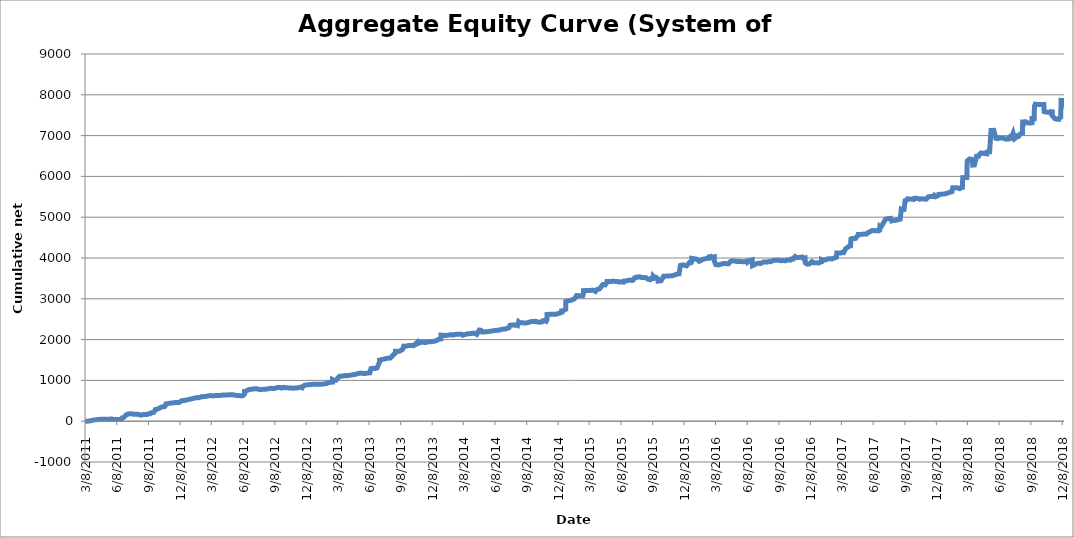
| Category | Series 0 |
|---|---|
| 3/8/11 | -0.48 |
| 3/18/11 | 2.52 |
| 3/23/11 | 7.84 |
| 3/25/11 | 14.73 |
| 3/25/11 | 19.9 |
| 3/30/11 | 25.12 |
| 4/1/11 | 24.35 |
| 4/1/11 | 22.37 |
| 4/4/11 | 30.29 |
| 4/5/11 | 30.83 |
| 4/6/11 | 36.66 |
| 4/11/11 | 36.3 |
| 4/13/11 | 41.86 |
| 4/21/11 | 45.6 |
| 4/25/11 | 47.14 |
| 5/9/11 | 47.8 |
| 5/20/11 | 51.32 |
| 5/25/11 | 51.32 |
| 5/31/11 | 41.53 |
| 5/31/11 | 43.62 |
| 6/7/11 | 43.72 |
| 6/14/11 | 43.76 |
| 6/15/11 | 44.97 |
| 6/21/11 | 48.27 |
| 6/22/11 | 48.52 |
| 6/22/11 | 55.12 |
| 6/23/11 | 79.96 |
| 6/27/11 | 85.18 |
| 6/29/11 | 89.69 |
| 6/29/11 | 108.52 |
| 7/6/11 | 163.64 |
| 7/12/11 | 176.84 |
| 7/20/11 | 183.99 |
| 7/20/11 | 187.84 |
| 7/21/11 | 190.32 |
| 7/21/11 | 182.13 |
| 7/25/11 | 172.68 |
| 8/2/11 | 170.04 |
| 8/4/11 | 166.14 |
| 8/8/11 | 169.65 |
| 8/9/11 | 166.17 |
| 8/16/11 | 148.46 |
| 8/17/11 | 150.55 |
| 8/25/11 | 164.96 |
| 8/26/11 | 166.06 |
| 8/30/11 | 166.94 |
| 9/2/11 | 162.89 |
| 9/8/11 | 182.56 |
| 9/8/11 | 186.85 |
| 9/12/11 | 184.1 |
| 9/14/11 | 186.1 |
| 9/14/11 | 194.94 |
| 9/14/11 | 199.23 |
| 9/15/11 | 208.14 |
| 9/22/11 | 210.54 |
| 9/26/11 | 257.94 |
| 9/27/11 | 276.84 |
| 9/27/11 | 283.66 |
| 9/30/11 | 286.41 |
| 10/7/11 | 308.85 |
| 10/11/11 | 329.42 |
| 10/12/11 | 333.1 |
| 10/13/11 | 340.3 |
| 10/14/11 | 343.34 |
| 10/17/11 | 349.84 |
| 10/20/11 | 351.44 |
| 10/20/11 | 349.8 |
| 10/24/11 | 356.19 |
| 10/24/11 | 374.99 |
| 10/27/11 | 391.71 |
| 10/28/11 | 424.21 |
| 10/28/11 | 430.51 |
| 10/31/11 | 426.99 |
| 11/7/11 | 439.09 |
| 11/9/11 | 437.41 |
| 11/9/11 | 441.81 |
| 11/9/11 | 449.28 |
| 11/17/11 | 448.04 |
| 11/25/11 | 460.24 |
| 12/1/11 | 455.29 |
| 12/1/11 | 458.89 |
| 12/1/11 | 465.27 |
| 12/8/11 | 467.43 |
| 12/9/11 | 489.79 |
| 12/12/11 | 499.79 |
| 12/13/11 | 501.11 |
| 12/13/11 | 501.63 |
| 12/15/11 | 503.83 |
| 12/19/11 | 505.15 |
| 12/19/11 | 505.92 |
| 1/4/12 | 535.53 |
| 1/4/12 | 543.93 |
| 1/25/12 | 578.04 |
| 2/1/12 | 576.94 |
| 2/2/12 | 579.58 |
| 2/7/12 | 597.26 |
| 2/8/12 | 598.61 |
| 2/21/12 | 608.18 |
| 3/1/12 | 625.62 |
| 3/2/12 | 628.15 |
| 3/5/12 | 627.67 |
| 3/5/12 | 623.35 |
| 3/12/12 | 619.31 |
| 3/12/12 | 618.54 |
| 3/13/12 | 624.02 |
| 3/19/12 | 628.5 |
| 3/26/12 | 628.1 |
| 3/28/12 | 634.26 |
| 4/3/12 | 633.6 |
| 4/3/12 | 648.6 |
| 4/17/12 | 644.31 |
| 4/23/12 | 640.15 |
| 4/25/12 | 643.57 |
| 4/26/12 | 645.87 |
| 4/27/12 | 654.67 |
| 5/9/12 | 650.15 |
| 5/15/12 | 634.64 |
| 5/15/12 | 643.68 |
| 5/15/12 | 654.39 |
| 5/16/12 | 650.34 |
| 5/17/12 | 647.06 |
| 5/24/12 | 629.68 |
| 5/31/12 | 622.09 |
| 6/1/12 | 616.97 |
| 6/7/12 | 623.37 |
| 6/8/12 | 628.32 |
| 6/12/12 | 667.47 |
| 6/12/12 | 733.2 |
| 6/15/12 | 738.27 |
| 6/18/12 | 745.53 |
| 6/20/12 | 762.03 |
| 6/22/12 | 767.43 |
| 7/2/12 | 784.53 |
| 7/3/12 | 787.06 |
| 7/6/12 | 789.26 |
| 7/10/12 | 791.46 |
| 7/17/12 | 795.64 |
| 7/19/12 | 800.37 |
| 7/25/12 | 775.77 |
| 8/1/12 | 779.62 |
| 8/6/12 | 781.22 |
| 8/7/12 | 787.16 |
| 8/15/12 | 787.44 |
| 8/17/12 | 789.12 |
| 8/20/12 | 794.18 |
| 8/20/12 | 806.14 |
| 8/21/12 | 807.34 |
| 8/23/12 | 801.78 |
| 8/29/12 | 806.18 |
| 8/31/12 | 802.22 |
| 9/4/12 | 800.92 |
| 9/7/12 | 807.2 |
| 9/10/12 | 811.38 |
| 9/14/12 | 823.08 |
| 9/14/12 | 826.32 |
| 9/18/12 | 825.96 |
| 9/20/12 | 828.32 |
| 9/24/12 | 823.59 |
| 9/24/12 | 815.22 |
| 9/27/12 | 811.89 |
| 9/27/12 | 814.59 |
| 10/3/12 | 829.67 |
| 10/8/12 | 822.63 |
| 10/8/12 | 818.23 |
| 10/10/12 | 814.53 |
| 10/10/12 | 814.93 |
| 10/17/12 | 816.58 |
| 10/19/12 | 808.33 |
| 10/31/12 | 809.09 |
| 10/31/12 | 810.17 |
| 11/2/12 | 830.19 |
| 11/15/12 | 819.52 |
| 11/23/12 | 837.59 |
| 11/26/12 | 822.19 |
| 11/28/12 | 853.06 |
| 11/30/12 | 867.25 |
| 12/3/12 | 882.73 |
| 12/4/12 | 896.13 |
| 12/10/12 | 890.74 |
| 12/10/12 | 892.54 |
| 12/12/12 | 897.82 |
| 12/20/12 | 899.03 |
| 12/28/12 | 903.31 |
| 1/4/13 | 905.95 |
| 1/4/13 | 898.39 |
| 1/15/13 | 906.58 |
| 1/16/13 | 911.31 |
| 1/16/13 | 915.49 |
| 1/28/13 | 910.17 |
| 2/1/13 | 918.42 |
| 2/5/13 | 923.5 |
| 2/8/13 | 944.75 |
| 2/8/13 | 948.43 |
| 2/13/13 | 949.09 |
| 2/13/13 | 958.45 |
| 2/15/13 | 956.81 |
| 2/22/13 | 958.11 |
| 2/22/13 | 1018.11 |
| 2/22/13 | 1005.13 |
| 2/26/13 | 999.85 |
| 2/27/13 | 1005.53 |
| 3/4/13 | 1004.21 |
| 3/11/13 | 1076.03 |
| 3/12/13 | 1096.18 |
| 3/14/13 | 1100.46 |
| 3/18/13 | 1100.57 |
| 3/20/13 | 1102.99 |
| 3/20/13 | 1117.14 |
| 4/2/13 | 1120.11 |
| 4/5/13 | 1112.96 |
| 4/10/13 | 1122.2 |
| 4/11/13 | 1122.59 |
| 4/22/13 | 1137.99 |
| 4/30/13 | 1149.4 |
| 4/30/13 | 1150.94 |
| 5/7/13 | 1170.05 |
| 5/16/13 | 1180.72 |
| 5/22/13 | 1168.84 |
| 5/30/13 | 1172.58 |
| 6/4/13 | 1182.23 |
| 6/10/13 | 1185.09 |
| 6/11/13 | 1197.3 |
| 6/13/13 | 1287.12 |
| 6/13/13 | 1280.08 |
| 6/14/13 | 1275.24 |
| 6/18/13 | 1296.94 |
| 6/20/13 | 1292.21 |
| 6/26/13 | 1291.76 |
| 6/26/13 | 1296.38 |
| 6/27/13 | 1297.94 |
| 6/28/13 | 1305.86 |
| 6/28/13 | 1301.79 |
| 7/1/13 | 1308.29 |
| 7/8/13 | 1448.29 |
| 7/8/13 | 1497.09 |
| 7/9/13 | 1512.49 |
| 7/10/13 | 1515.24 |
| 7/17/13 | 1514.24 |
| 7/17/13 | 1537.73 |
| 7/30/13 | 1542.25 |
| 8/1/13 | 1546.21 |
| 8/8/13 | 1547.13 |
| 8/9/13 | 1560.66 |
| 8/23/13 | 1675.5 |
| 8/23/13 | 1712.68 |
| 8/27/13 | 1711.03 |
| 8/28/13 | 1705.39 |
| 9/3/13 | 1712.79 |
| 9/4/13 | 1717.41 |
| 9/10/13 | 1746.41 |
| 9/12/13 | 1739.26 |
| 9/12/13 | 1753.12 |
| 9/13/13 | 1759.88 |
| 9/16/13 | 1837.1 |
| 9/19/13 | 1833.68 |
| 9/20/13 | 1851.56 |
| 10/1/13 | 1856.84 |
| 10/8/13 | 1858.6 |
| 10/14/13 | 1849.36 |
| 10/15/13 | 1866.96 |
| 10/15/13 | 1870.37 |
| 10/18/13 | 1880.89 |
| 10/23/13 | 1916.38 |
| 10/23/13 | 1888.21 |
| 10/28/13 | 1907.9 |
| 10/28/13 | 1920.14 |
| 11/6/13 | 1936.09 |
| 11/7/13 | 1934.73 |
| 11/18/13 | 1929.01 |
| 11/20/13 | 1929.67 |
| 11/25/13 | 1941.33 |
| 11/25/13 | 1950.02 |
| 11/29/13 | 1952.55 |
| 12/5/13 | 1946.06 |
| 12/18/13 | 1968.66 |
| 12/23/13 | 1988.36 |
| 12/23/13 | 2011.92 |
| 12/26/13 | 2007.41 |
| 12/30/13 | 2014.01 |
| 1/2/14 | 2017.43 |
| 1/2/14 | 2110.23 |
| 1/14/14 | 2100.44 |
| 1/15/14 | 2095.4 |
| 1/16/14 | 2096.94 |
| 1/17/14 | 2102.44 |
| 2/3/14 | 2121.8 |
| 2/6/14 | 2110.32 |
| 2/12/14 | 2127.37 |
| 3/3/14 | 2132.54 |
| 3/3/14 | 2115.51 |
| 3/4/14 | 2108.8 |
| 3/6/14 | 2108.36 |
| 3/7/14 | 2131.16 |
| 3/10/14 | 2118.65 |
| 3/10/14 | 2129.18 |
| 3/14/14 | 2127.53 |
| 3/19/14 | 2140.84 |
| 3/24/14 | 2140.84 |
| 3/27/14 | 2145.52 |
| 3/28/14 | 2141.22 |
| 4/2/14 | 2152.33 |
| 4/4/14 | 2154.73 |
| 4/4/14 | 2148.9 |
| 4/10/14 | 2153.82 |
| 4/11/14 | 2150.54 |
| 4/16/14 | 2128.65 |
| 4/17/14 | 2131.51 |
| 4/23/14 | 2234.06 |
| 4/25/14 | 2230.9 |
| 4/28/14 | 2229.25 |
| 5/1/14 | 2187.15 |
| 5/7/14 | 2188.06 |
| 5/13/14 | 2192.46 |
| 5/16/14 | 2191.03 |
| 5/21/14 | 2200 |
| 5/23/14 | 2206.93 |
| 5/27/14 | 2207.13 |
| 5/27/14 | 2212.17 |
| 5/30/14 | 2212.41 |
| 5/30/14 | 2225.61 |
| 6/9/14 | 2224.62 |
| 6/18/14 | 2230.12 |
| 7/2/14 | 2260.72 |
| 7/3/14 | 2268.97 |
| 7/10/14 | 2263.14 |
| 7/10/14 | 2280.22 |
| 7/15/14 | 2287.15 |
| 7/17/14 | 2297.15 |
| 7/18/14 | 2291.21 |
| 7/21/14 | 2350.88 |
| 7/22/14 | 2355.4 |
| 7/30/14 | 2361.6 |
| 8/5/14 | 2351.59 |
| 8/8/14 | 2358.84 |
| 8/12/14 | 2344.76 |
| 8/15/14 | 2437.73 |
| 8/19/14 | 2412.98 |
| 8/22/14 | 2413.4 |
| 8/22/14 | 2413.51 |
| 8/26/14 | 2411.71 |
| 8/28/14 | 2407.39 |
| 9/3/14 | 2404.97 |
| 9/3/14 | 2408.09 |
| 9/3/14 | 2406.11 |
| 9/8/14 | 2410.18 |
| 9/9/14 | 2429.21 |
| 9/10/14 | 2430.57 |
| 9/18/14 | 2433.27 |
| 9/22/14 | 2443.83 |
| 9/25/14 | 2446.71 |
| 9/25/14 | 2454.81 |
| 9/29/14 | 2444.55 |
| 10/3/14 | 2447.61 |
| 10/13/14 | 2423.85 |
| 10/22/14 | 2436.28 |
| 10/23/14 | 2440.02 |
| 10/24/14 | 2460.9 |
| 10/28/14 | 2468.42 |
| 10/28/14 | 2457.57 |
| 11/3/14 | 2447.62 |
| 11/5/14 | 2482.74 |
| 11/5/14 | 2615.34 |
| 11/6/14 | 2619.3 |
| 11/10/14 | 2619.06 |
| 11/11/14 | 2624.1 |
| 11/24/14 | 2619.54 |
| 12/3/14 | 2624.38 |
| 12/18/14 | 2667.48 |
| 12/18/14 | 2704.22 |
| 12/22/14 | 2706.97 |
| 12/30/14 | 2744.67 |
| 12/30/14 | 2764.62 |
| 12/30/14 | 2933.42 |
| 1/6/15 | 2952.5 |
| 1/12/15 | 2960.09 |
| 1/14/15 | 2981.15 |
| 1/23/15 | 2993.69 |
| 1/27/15 | 3037.03 |
| 1/28/15 | 3040.11 |
| 1/30/15 | 3080.11 |
| 2/5/15 | 3074.39 |
| 2/17/15 | 3073.87 |
| 2/19/15 | 3086.91 |
| 2/19/15 | 3132.93 |
| 2/19/15 | 3200.25 |
| 2/20/15 | 3213.66 |
| 3/20/15 | 3208.71 |
| 3/26/15 | 3180.11 |
| 3/30/15 | 3225.54 |
| 4/7/15 | 3245.43 |
| 4/8/15 | 3249.17 |
| 4/8/15 | 3250.25 |
| 4/16/15 | 3348.55 |
| 4/20/15 | 3349.21 |
| 4/22/15 | 3345.58 |
| 4/22/15 | 3347.26 |
| 4/23/15 | 3341.66 |
| 4/27/15 | 3384.43 |
| 4/28/15 | 3423.43 |
| 5/5/15 | 3424.43 |
| 5/11/15 | 3424.71 |
| 5/14/15 | 3429.77 |
| 5/14/15 | 3406.01 |
| 5/20/15 | 3427.97 |
| 5/26/15 | 3423.24 |
| 6/1/15 | 3419.61 |
| 6/1/15 | 3419.72 |
| 6/2/15 | 3413.44 |
| 6/4/15 | 3407.06 |
| 6/8/15 | 3418.56 |
| 6/15/15 | 3409.1 |
| 6/17/15 | 3436.7 |
| 6/19/15 | 3452.54 |
| 6/23/15 | 3438.14 |
| 6/26/15 | 3447.54 |
| 7/1/15 | 3456.54 |
| 7/7/15 | 3459.4 |
| 7/10/15 | 3448.18 |
| 7/13/15 | 3458.41 |
| 7/17/15 | 3513.85 |
| 7/21/15 | 3530.41 |
| 7/24/15 | 3525.21 |
| 7/31/15 | 3540.39 |
| 8/7/15 | 3520.37 |
| 8/19/15 | 3518.5 |
| 8/20/15 | 3516.82 |
| 8/21/15 | 3497.02 |
| 8/24/15 | 3485.12 |
| 8/31/15 | 3467.96 |
| 9/3/15 | 3498.32 |
| 9/8/15 | 3497.11 |
| 9/9/15 | 3499.07 |
| 9/9/15 | 3558.07 |
| 9/14/15 | 3515.57 |
| 9/17/15 | 3525.03 |
| 9/22/15 | 3493.04 |
| 9/22/15 | 3471.17 |
| 9/23/15 | 3434.65 |
| 9/28/15 | 3439.6 |
| 9/28/15 | 3439.33 |
| 10/2/15 | 3443.62 |
| 10/7/15 | 3516.42 |
| 10/7/15 | 3534.35 |
| 10/9/15 | 3552.87 |
| 10/19/15 | 3557.38 |
| 10/20/15 | 3562.5 |
| 11/4/15 | 3565.14 |
| 11/5/15 | 3582.3 |
| 11/17/15 | 3604.55 |
| 11/20/15 | 3613.02 |
| 11/23/15 | 3612.69 |
| 11/27/15 | 3818.49 |
| 12/4/15 | 3831.54 |
| 12/8/15 | 3822.66 |
| 12/9/15 | 3826.4 |
| 12/15/15 | 3808.4 |
| 12/16/15 | 3801.55 |
| 12/17/15 | 3823.88 |
| 12/23/15 | 3888.28 |
| 12/28/15 | 3884.43 |
| 12/28/15 | 3888.59 |
| 12/29/15 | 3884.19 |
| 12/30/15 | 3910.16 |
| 12/30/15 | 3990.8 |
| 12/31/15 | 3983.8 |
| 1/14/16 | 3969.72 |
| 1/20/16 | 3919.86 |
| 1/21/16 | 3928.33 |
| 1/25/16 | 3934.69 |
| 1/26/16 | 3938.76 |
| 1/29/16 | 3964.72 |
| 2/18/16 | 4001.13 |
| 2/19/16 | 4040.91 |
| 2/19/16 | 4083.04 |
| 2/23/16 | 4006.11 |
| 2/26/16 | 4018.51 |
| 3/4/16 | 4030.06 |
| 3/4/16 | 3934.77 |
| 3/8/16 | 3840.05 |
| 3/9/16 | 3852.04 |
| 3/10/16 | 3824.28 |
| 3/16/16 | 3829.23 |
| 3/18/16 | 3852.66 |
| 3/31/16 | 3866.85 |
| 3/31/16 | 3864.32 |
| 4/14/16 | 3857.52 |
| 4/15/16 | 3866.43 |
| 4/19/16 | 3908.63 |
| 4/19/16 | 3921.17 |
| 4/19/16 | 3931.29 |
| 4/26/16 | 3934.33 |
| 5/10/16 | 3913.1 |
| 5/10/16 | 3909.82 |
| 5/13/16 | 3912.46 |
| 5/13/16 | 3894.64 |
| 5/27/16 | 3910.48 |
| 6/1/16 | 3910.28 |
| 6/8/16 | 3925.84 |
| 6/9/16 | 3898.67 |
| 6/14/16 | 3931.07 |
| 6/14/16 | 3943.67 |
| 6/16/16 | 3951.35 |
| 6/16/16 | 3952.56 |
| 6/22/16 | 3952.89 |
| 6/23/16 | 3814.09 |
| 7/1/16 | 3845.33 |
| 7/6/16 | 3865.79 |
| 7/12/16 | 3875.23 |
| 7/15/16 | 3862.33 |
| 7/20/16 | 3880.25 |
| 7/21/16 | 3901.13 |
| 7/25/16 | 3901.89 |
| 7/27/16 | 3899.93 |
| 8/3/16 | 3898.29 |
| 8/8/16 | 3912.15 |
| 8/8/16 | 3917.75 |
| 8/15/16 | 3910.1 |
| 8/16/16 | 3911.26 |
| 8/16/16 | 3887.26 |
| 8/17/16 | 3895.06 |
| 8/18/16 | 3929.38 |
| 8/19/16 | 3943.13 |
| 8/24/16 | 3941.17 |
| 8/25/16 | 3944.91 |
| 8/25/16 | 3940.59 |
| 8/25/16 | 3944.36 |
| 9/1/16 | 3944.92 |
| 9/2/16 | 3954.41 |
| 9/7/16 | 3947.61 |
| 9/13/16 | 3933.53 |
| 9/19/16 | 3937.41 |
| 9/21/16 | 3949.73 |
| 9/21/16 | 3949.53 |
| 9/21/16 | 3931.78 |
| 9/27/16 | 3932.82 |
| 9/27/16 | 3908.84 |
| 9/28/16 | 3950.6 |
| 9/30/16 | 3947.27 |
| 10/3/16 | 3949.79 |
| 10/3/16 | 3947.43 |
| 10/5/16 | 3946.11 |
| 10/7/16 | 3947.59 |
| 10/11/16 | 3948.03 |
| 10/12/16 | 3944.67 |
| 10/13/16 | 3974.05 |
| 10/19/16 | 3974.05 |
| 10/21/16 | 4006.17 |
| 10/24/16 | 4032.82 |
| 10/24/16 | 4030.62 |
| 10/25/16 | 4026.14 |
| 10/26/16 | 4019.25 |
| 10/27/16 | 4009.98 |
| 10/28/16 | 4012.22 |
| 10/28/16 | 4019.24 |
| 11/2/16 | 4013.04 |
| 11/9/16 | 4017.68 |
| 11/11/16 | 4029.67 |
| 11/14/16 | 4024.06 |
| 11/17/16 | 3990.26 |
| 11/18/16 | 3978.9 |
| 11/22/16 | 4001.34 |
| 11/22/16 | 4015.18 |
| 11/23/16 | 3877.98 |
| 11/29/16 | 3847.82 |
| 12/1/16 | 3836.6 |
| 12/5/16 | 3857.66 |
| 12/6/16 | 3864.48 |
| 12/8/16 | 3882.16 |
| 12/9/16 | 3880.12 |
| 12/12/16 | 3910.26 |
| 12/15/16 | 3888.39 |
| 12/19/16 | 3883.63 |
| 12/27/16 | 3882.79 |
| 12/29/16 | 3874.08 |
| 12/29/16 | 3875.13 |
| 12/30/16 | 3875.25 |
| 1/9/17 | 3906.71 |
| 1/9/17 | 3961.91 |
| 1/9/17 | 3953.66 |
| 1/13/17 | 3949.92 |
| 1/20/17 | 3955.24 |
| 1/23/17 | 3960.3 |
| 1/25/17 | 3968.55 |
| 1/26/17 | 3977.02 |
| 1/27/17 | 3999.52 |
| 2/3/17 | 3983.4 |
| 2/3/17 | 3963.24 |
| 2/7/17 | 3975.48 |
| 2/7/17 | 3980.94 |
| 2/7/17 | 3988.77 |
| 2/13/17 | 3994.27 |
| 2/13/17 | 3999.77 |
| 2/15/17 | 4003.05 |
| 2/21/17 | 4018.56 |
| 2/22/17 | 4121.95 |
| 3/3/17 | 4120.96 |
| 3/3/17 | 4118.2 |
| 3/7/17 | 4123.2 |
| 3/9/17 | 4136.62 |
| 3/10/17 | 4137.94 |
| 3/14/17 | 4132.66 |
| 3/20/17 | 4230.26 |
| 3/22/17 | 4250.28 |
| 3/23/17 | 4250.61 |
| 3/28/17 | 4275.06 |
| 3/29/17 | 4277.14 |
| 3/29/17 | 4292.76 |
| 3/31/17 | 4300.35 |
| 4/3/17 | 4300.99 |
| 4/3/17 | 4299.87 |
| 4/4/17 | 4467.63 |
| 4/5/17 | 4468.11 |
| 4/5/17 | 4480.33 |
| 4/7/17 | 4480.21 |
| 4/10/17 | 4478.69 |
| 4/13/17 | 4477.26 |
| 4/18/17 | 4481.34 |
| 4/18/17 | 4487.64 |
| 4/21/17 | 4525.34 |
| 4/21/17 | 4531.94 |
| 4/24/17 | 4546.13 |
| 4/25/17 | 4577.59 |
| 5/2/17 | 4576.04 |
| 5/5/17 | 4582.08 |
| 5/16/17 | 4588.68 |
| 5/17/17 | 4578.03 |
| 5/19/17 | 4586.4 |
| 5/22/17 | 4605.25 |
| 5/23/17 | 4620.98 |
| 5/25/17 | 4631.22 |
| 5/30/17 | 4646.95 |
| 6/1/17 | 4671.05 |
| 6/5/17 | 4674.69 |
| 6/16/17 | 4668.01 |
| 6/19/17 | 4672.25 |
| 6/21/17 | 4664.55 |
| 6/22/17 | 4664.07 |
| 6/26/17 | 4678.48 |
| 6/27/17 | 4773.52 |
| 6/28/17 | 4770.92 |
| 6/30/17 | 4755.08 |
| 7/11/17 | 4916.41 |
| 7/12/17 | 4922.81 |
| 7/14/17 | 4954.27 |
| 7/28/17 | 4971.37 |
| 7/31/17 | 4910.65 |
| 8/1/17 | 4908.45 |
| 8/3/17 | 4922.37 |
| 8/4/17 | 4924.77 |
| 8/8/17 | 4919.71 |
| 8/16/17 | 4932.55 |
| 8/17/17 | 4947.18 |
| 8/21/17 | 4942.77 |
| 8/23/17 | 4952.87 |
| 8/25/17 | 4954.19 |
| 8/28/17 | 5201.04 |
| 8/29/17 | 5193.23 |
| 8/31/17 | 5194.67 |
| 9/5/17 | 5192.11 |
| 9/8/17 | 5404.99 |
| 9/12/17 | 5414.23 |
| 9/12/17 | 5407.19 |
| 9/14/17 | 5407.96 |
| 9/15/17 | 5450.16 |
| 9/26/17 | 5442.08 |
| 10/3/17 | 5435.7 |
| 10/4/17 | 5446.26 |
| 10/4/17 | 5452.74 |
| 10/5/17 | 5465.17 |
| 10/12/17 | 5462.17 |
| 10/20/17 | 5442.1 |
| 10/20/17 | 5440.45 |
| 10/26/17 | 5451.17 |
| 11/3/17 | 5447.43 |
| 11/8/17 | 5440.5 |
| 11/9/17 | 5453.81 |
| 11/10/17 | 5450.29 |
| 11/15/17 | 5503.3 |
| 11/27/17 | 5506.98 |
| 11/29/17 | 5520.62 |
| 12/1/17 | 5536.79 |
| 12/5/17 | 5502.91 |
| 12/7/17 | 5507.39 |
| 12/12/17 | 5526.71 |
| 12/14/17 | 5558.72 |
| 12/29/17 | 5568.16 |
| 1/4/18 | 5575.75 |
| 1/5/18 | 5576.55 |
| 1/10/18 | 5594.92 |
| 1/22/18 | 5627.05 |
| 1/23/18 | 5682.6 |
| 1/24/18 | 5721.21 |
| 2/5/18 | 5723.09 |
| 2/13/18 | 5699.61 |
| 2/15/18 | 5707.53 |
| 2/16/18 | 5723.57 |
| 2/21/18 | 5729.4 |
| 2/22/18 | 5969.2 |
| 2/26/18 | 5970.74 |
| 2/28/18 | 5970.24 |
| 3/6/18 | 5972.64 |
| 3/6/18 | 5973.99 |
| 3/7/18 | 6377.71 |
| 3/9/18 | 6381.89 |
| 3/13/18 | 6424.13 |
| 3/19/18 | 6422.13 |
| 3/20/18 | 6406.38 |
| 3/22/18 | 6406.83 |
| 3/23/18 | 6276.83 |
| 3/28/18 | 6280.35 |
| 3/29/18 | 6258.03 |
| 4/3/18 | 6494.89 |
| 4/9/18 | 6494.13 |
| 4/9/18 | 6513.48 |
| 4/12/18 | 6539.88 |
| 4/13/18 | 6531.87 |
| 4/16/18 | 6574.66 |
| 4/16/18 | 6574.98 |
| 5/3/18 | 6552.65 |
| 5/3/18 | 6594.65 |
| 5/4/18 | 6590.29 |
| 5/7/18 | 6610.64 |
| 5/11/18 | 6608.24 |
| 5/15/18 | 7124.94 |
| 5/23/18 | 7128.46 |
| 5/23/18 | 7118.89 |
| 5/29/18 | 6933.4 |
| 5/31/18 | 6927.9 |
| 6/4/18 | 6925.74 |
| 6/5/18 | 6924.09 |
| 6/7/18 | 6943.89 |
| 6/19/18 | 6936.25 |
| 6/28/18 | 6912.05 |
| 7/5/18 | 6918.32 |
| 7/6/18 | 6956.4 |
| 7/9/18 | 6975.76 |
| 7/13/18 | 6949.36 |
| 7/18/18 | 7055.8 |
| 7/20/18 | 6991.34 |
| 7/23/18 | 6994.74 |
| 7/24/18 | 6935.89 |
| 7/30/18 | 6977.74 |
| 8/3/18 | 6980.89 |
| 8/7/18 | 7037.99 |
| 8/8/18 | 7039.11 |
| 8/13/18 | 7051.43 |
| 8/14/18 | 7017.68 |
| 8/15/18 | 7334.62 |
| 8/24/18 | 7340.34 |
| 8/27/18 | 7312.44 |
| 8/27/18 | 7288.41 |
| 8/29/18 | 7295.81 |
| 8/31/18 | 7312.01 |
| 9/5/18 | 7306.05 |
| 9/11/18 | 7313.42 |
| 9/11/18 | 7415.21 |
| 9/17/18 | 7410.59 |
| 9/18/18 | 7421.55 |
| 9/18/18 | 7723.55 |
| 9/20/18 | 7769.31 |
| 9/21/18 | 7766.35 |
| 9/25/18 | 7763.83 |
| 10/15/18 | 7761.95 |
| 10/15/18 | 7739.75 |
| 10/16/18 | 7589.34 |
| 10/17/18 | 7607.43 |
| 10/23/18 | 7574.95 |
| 10/25/18 | 7566.04 |
| 11/6/18 | 7573.32 |
| 11/8/18 | 7582.36 |
| 11/8/18 | 7588.8 |
| 11/8/18 | 7636.41 |
| 11/8/18 | 7493.01 |
| 11/9/18 | 7488.72 |
| 11/16/18 | 7413.32 |
| 11/23/18 | 7401.62 |
| 11/28/18 | 7402.52 |
| 11/29/18 | 7433.1 |
| 11/29/18 | 7435.42 |
| 12/3/18 | 7453.54 |
| 12/4/18 | 7837.7 |
| 12/4/18 | 7863.1 |
| 12/7/18 | 7862.34 |
| 12/10/18 | 7822.96 |
| 12/10/18 | 7916.79 |
| 12/11/18 | 7884.57 |
| 12/12/18 | 7896.56 |